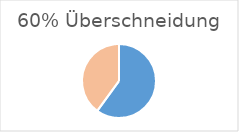
| Category | Series 0 |
|---|---|
| 0 | 60 |
| 1 | 40 |